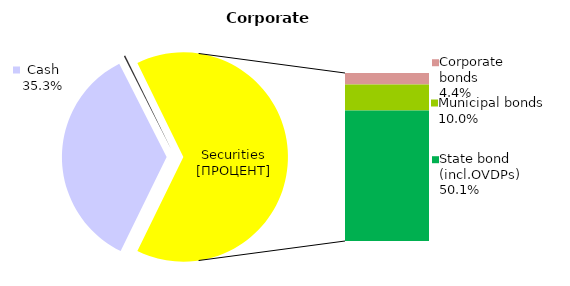
| Category | Corporate |
|---|---|
| Cash | 113.909 |
| Bank metals | 0 |
| Real estate | 0 |
| Other assets | 0.74 |
| Equities | 0.022 |
| Corporate bonds | 14.2 |
| Municipal bonds | 32.181 |
| State bond (incl.OVDPs) | 161.857 |